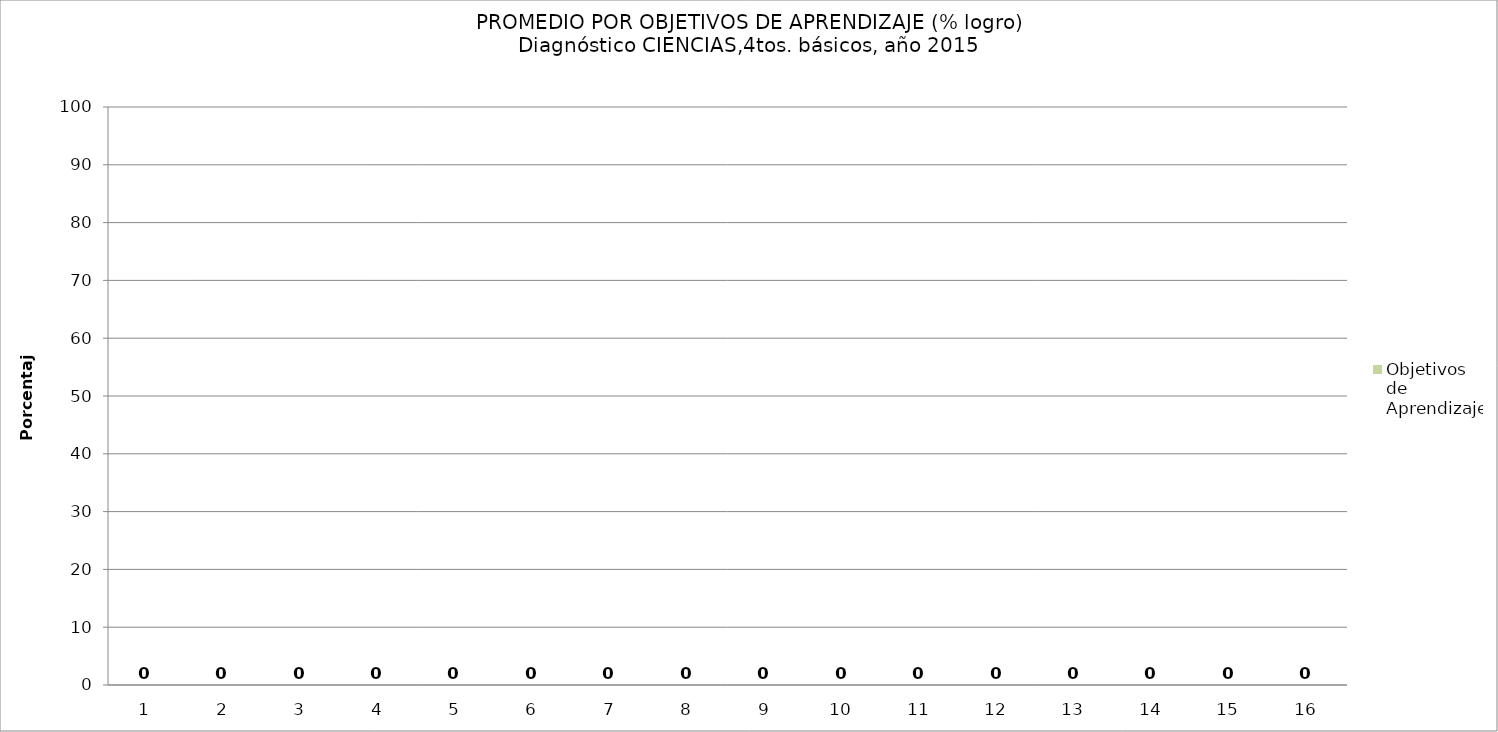
| Category | Objetivos de Aprendizaje |
|---|---|
| 0 | 0 |
| 1 | 0 |
| 2 | 0 |
| 3 | 0 |
| 4 | 0 |
| 5 | 0 |
| 6 | 0 |
| 7 | 0 |
| 8 | 0 |
| 9 | 0 |
| 10 | 0 |
| 11 | 0 |
| 12 | 0 |
| 13 | 0 |
| 14 | 0 |
| 15 | 0 |